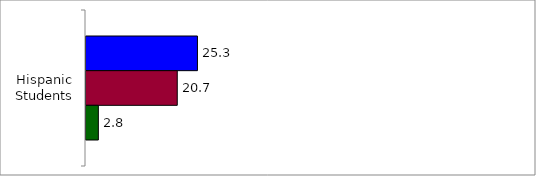
| Category | 50 States and D.C. | SREB States | State |
|---|---|---|---|
| 0 | 25.27 | 20.694 | 2.799 |